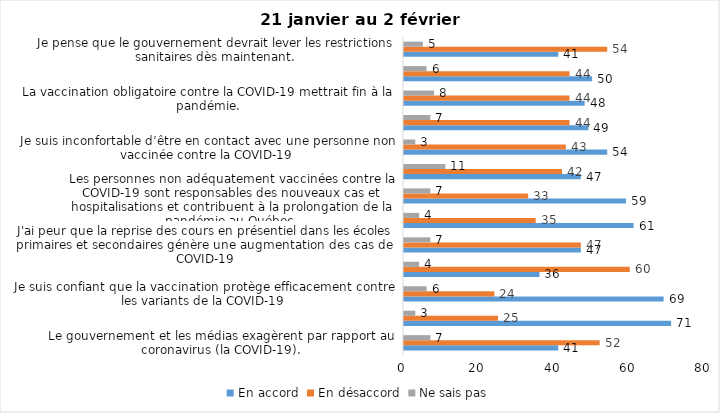
| Category | En accord | En désaccord | Ne sais pas |
|---|---|---|---|
| Le gouvernement et les médias exagèrent par rapport au coronavirus (la COVID-19). | 41 | 52 | 7 |
| J’ai peur que le système de santé soit débordé par les cas de COVID-19. | 71 | 25 | 3 |
| Je suis confiant que la vaccination protège efficacement contre les variants de la COVID-19 | 69 | 24 | 6 |
| Je suis favorable à ce que le port du masque ne soit plus obligatoire au Québec. | 36 | 60 | 4 |
| J'ai peur que la reprise des cours en présentiel dans les écoles primaires et secondaires génère une augmentation des cas de COVID-19 | 47 | 47 | 7 |
| Je crois que le passeport vaccinal devrait être requis pour davantage de services et commerces (ex. : spas, centre d’achats, centre de soins personnels. | 61 | 35 | 4 |
| Les personnes non adéquatement vaccinées contre la COVID-19 sont responsables des nouveaux cas et hospitalisations et contribuent à la prolongation de la pandémie au Québec. | 59 | 33 | 7 |
| La pandémie ne sera pas terminée au Québec avant que tous les habitants de la terre puissent être vaccinés contre la COVID-19.   | 47 | 42 | 11 |
| Je suis inconfortable d’être en contact avec une personne non vaccinée contre la COVID-19 | 54 | 43 | 3 |
| Je n'ai pas peur du variant Omicron, car il semble moins dangereux pour la santé. | 49 | 44 | 7 |
| La vaccination obligatoire contre la COVID-19 mettrait fin à la pandémie. | 48 | 44 | 8 |
| Je suis favorable à ce que les personnes non vaccinées paient une taxe supplémentaire (contribution santé). | 50 | 44 | 6 |
| Je pense que le gouvernement devrait lever les restrictions sanitaires dès maintenant. | 41 | 54 | 5 |